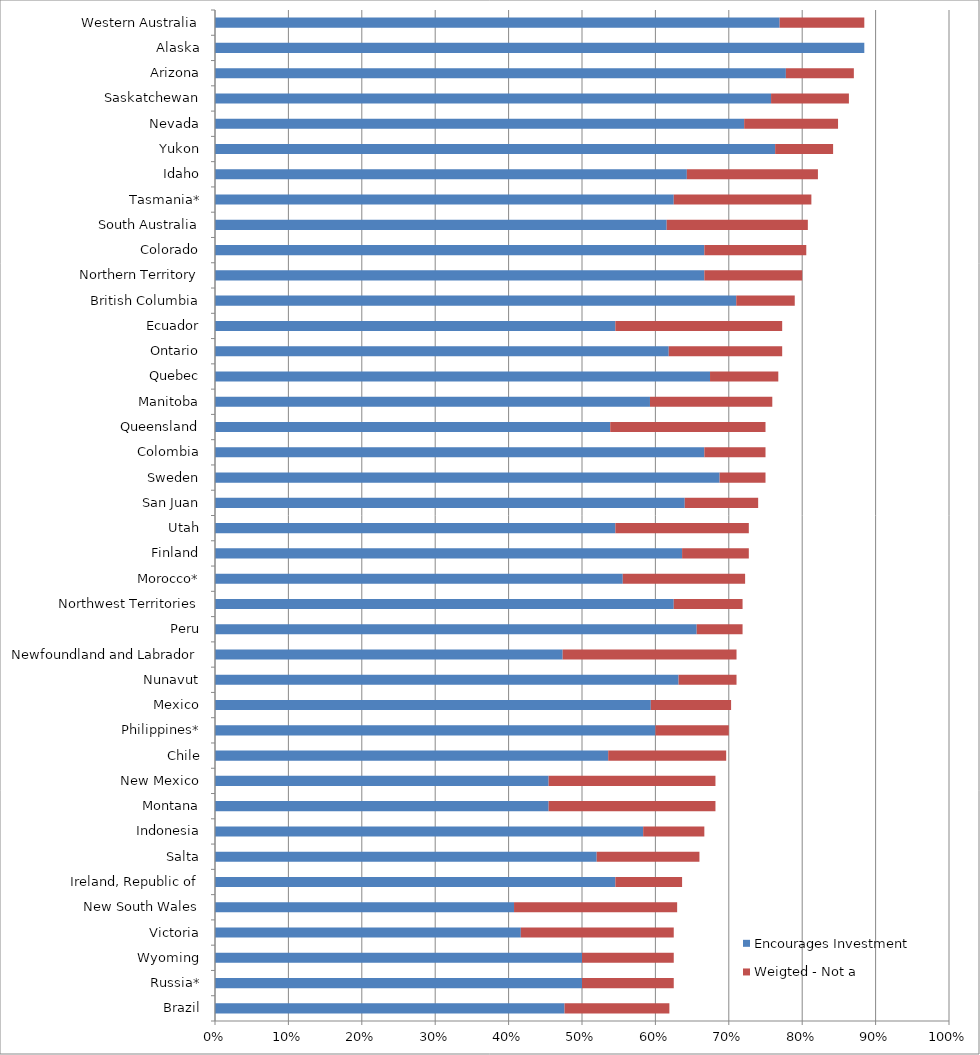
| Category | Encourages Investment | Weigted - Not a Deterrent |
|---|---|---|
| Brazil | 0.476 | 0.143 |
| Russia* | 0.5 | 0.125 |
| Wyoming | 0.5 | 0.125 |
| Victoria | 0.417 | 0.208 |
| New South Wales | 0.407 | 0.222 |
| Ireland, Republic of | 0.545 | 0.091 |
| Salta | 0.52 | 0.14 |
| Indonesia | 0.583 | 0.083 |
| Montana | 0.455 | 0.227 |
| New Mexico | 0.455 | 0.227 |
| Chile | 0.536 | 0.161 |
| Philippines* | 0.6 | 0.1 |
| Mexico | 0.594 | 0.109 |
| Nunavut | 0.632 | 0.079 |
| Newfoundland and Labrador | 0.474 | 0.237 |
| Peru | 0.656 | 0.062 |
| Northwest Territories | 0.625 | 0.094 |
| Morocco* | 0.556 | 0.167 |
| Finland | 0.636 | 0.091 |
| Utah | 0.545 | 0.182 |
| San Juan | 0.64 | 0.1 |
| Sweden | 0.688 | 0.062 |
| Colombia | 0.667 | 0.083 |
| Queensland | 0.538 | 0.212 |
| Manitoba | 0.593 | 0.167 |
| Quebec | 0.674 | 0.093 |
| Ontario | 0.618 | 0.155 |
| Ecuador | 0.545 | 0.227 |
| British Columbia | 0.71 | 0.08 |
| Northern Territory | 0.667 | 0.133 |
| Colorado | 0.667 | 0.139 |
| South Australia | 0.615 | 0.192 |
| Tasmania* | 0.625 | 0.188 |
| Idaho | 0.643 | 0.179 |
| Yukon | 0.763 | 0.079 |
| Nevada | 0.721 | 0.128 |
| Saskatchewan | 0.758 | 0.106 |
| Arizona | 0.778 | 0.093 |
| Alaska | 0.885 | 0 |
| Western Australia | 0.769 | 0.115 |